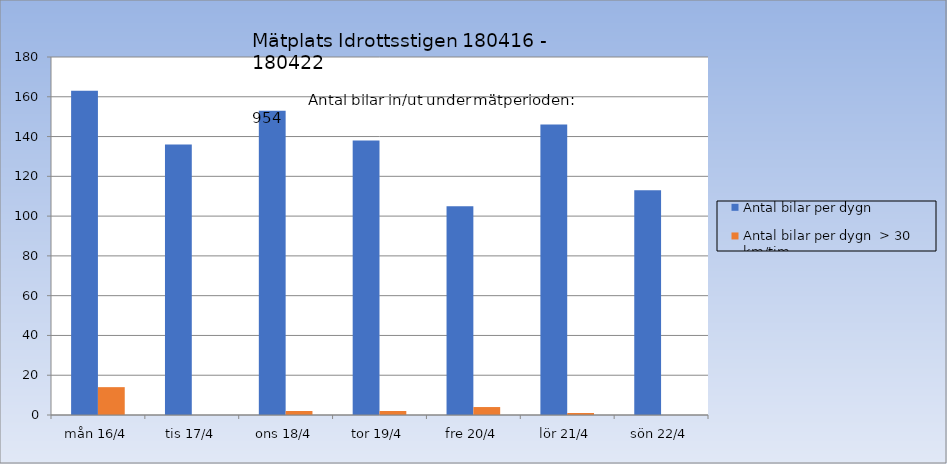
| Category | Antal bilar per dygn | Antal bilar per dygn  > 30 km/tim |
|---|---|---|
| mån 16/4 | 163 | 14 |
| tis 17/4 | 136 | 0 |
| ons 18/4 | 153 | 2 |
| tor 19/4 | 138 | 2 |
| fre 20/4 | 105 | 4 |
| lör 21/4 | 146 | 1 |
| sön 22/4 | 113 | 0 |